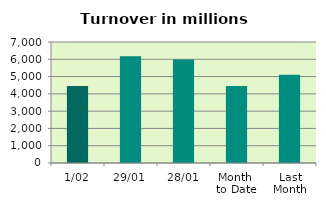
| Category | Series 0 |
|---|---|
| 1/02 | 4460.058 |
| 29/01 | 6171.322 |
| 28/01 | 5982.676 |
| Month 
to Date | 4460.058 |
| Last
Month | 5105.691 |